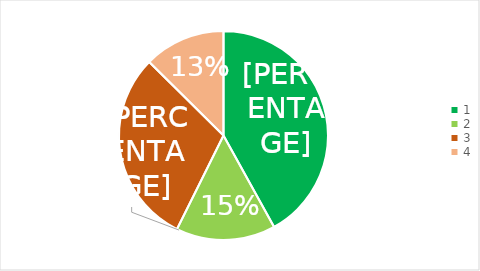
| Category | Series 0 |
|---|---|
| 0 | 0.42 |
| 1 | 0.154 |
| 2 | 0.301 |
| 3 | 0.126 |